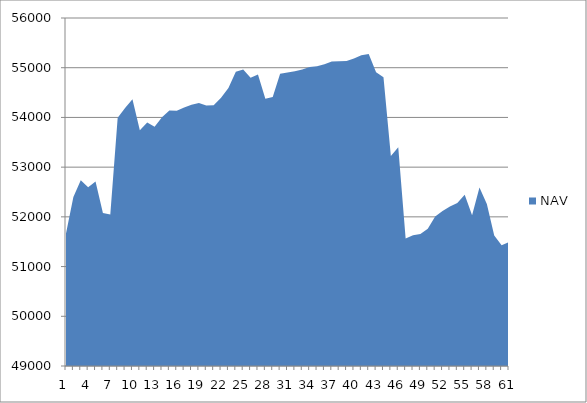
| Category | NAV |
|---|---|
| 0 | 51667 |
| 1 | 52397 |
| 2 | 52733.957 |
| 3 | 52597.875 |
| 4 | 52708.772 |
| 5 | 52075.184 |
| 6 | 52046.775 |
| 7 | 53991.219 |
| 8 | 54189.909 |
| 9 | 54364.909 |
| 10 | 53739.909 |
| 11 | 53899.542 |
| 12 | 53812.294 |
| 13 | 54003.961 |
| 14 | 54140.037 |
| 15 | 54132.37 |
| 16 | 54197.37 |
| 17 | 54255.812 |
| 18 | 54292.622 |
| 19 | 54240.699 |
| 20 | 54246.834 |
| 21 | 54397.391 |
| 22 | 54592.197 |
| 23 | 54920.119 |
| 24 | 54963.245 |
| 25 | 54796.799 |
| 26 | 54863.963 |
| 27 | 54375.975 |
| 28 | 54409.015 |
| 29 | 54878.402 |
| 30 | 54905.151 |
| 31 | 54927.958 |
| 32 | 54964.157 |
| 33 | 55012.385 |
| 34 | 55031.616 |
| 35 | 55070.791 |
| 36 | 55126.461 |
| 37 | 55131.71 |
| 38 | 55133.391 |
| 39 | 55184.783 |
| 40 | 55249.119 |
| 41 | 55278.196 |
| 42 | 54909.993 |
| 43 | 54807.052 |
| 44 | 53224.092 |
| 45 | 53401.214 |
| 46 | 51567.133 |
| 47 | 51627.536 |
| 48 | 51656.382 |
| 49 | 51762.295 |
| 50 | 52007.329 |
| 51 | 52120.149 |
| 52 | 52206.26 |
| 53 | 52279.944 |
| 54 | 52443.406 |
| 55 | 52034.315 |
| 56 | 52592.093 |
| 57 | 52259.795 |
| 58 | 51622.988 |
| 59 | 51427.586 |
| 60 | 51492.401 |